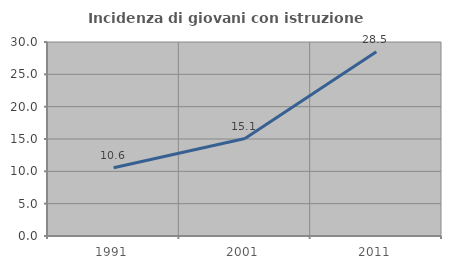
| Category | Incidenza di giovani con istruzione universitaria |
|---|---|
| 1991.0 | 10.556 |
| 2001.0 | 15.064 |
| 2011.0 | 28.502 |